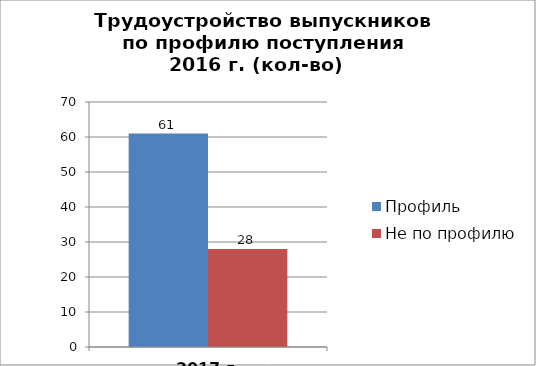
| Category | Профиль | Не по профилю |
|---|---|---|
| 2017 г. | 61 | 28 |